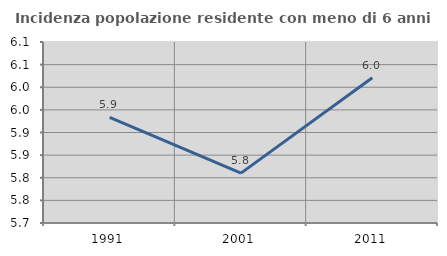
| Category | Incidenza popolazione residente con meno di 6 anni |
|---|---|
| 1991.0 | 5.933 |
| 2001.0 | 5.81 |
| 2011.0 | 6.021 |